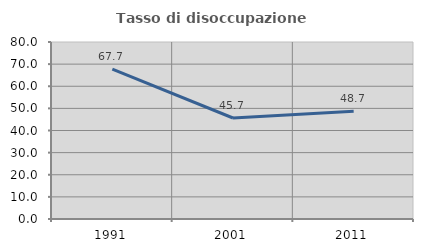
| Category | Tasso di disoccupazione giovanile  |
|---|---|
| 1991.0 | 67.692 |
| 2001.0 | 45.652 |
| 2011.0 | 48.718 |